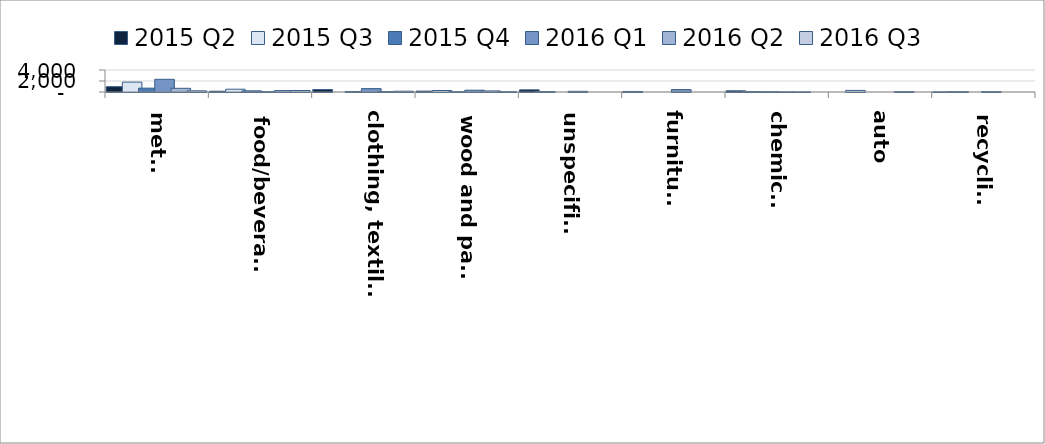
| Category | 2015 Q2 | 2015 Q3 | 2015 Q4 | 2016 Q1 | 2016 Q2 | 2016 Q3 |
|---|---|---|---|---|---|---|
| metal | 966 | 1798 | 701 | 2308 | 673 | 213 |
| food/beverages | 143 | 506 | 210 | 60 | 251 | 274 |
| clothing, textile,
 leather | 444 | 0 | 96 | 614 | 76 | 140 |
| wood and paper | 161 | 271 | 49 | 324 | 195 | 51 |
| unspecified | 396 | 75 | 0 | 124 | 0 | 0 |
| furniture | 102 | 0 | 0 | 440 | 0 | 0 |
| chemical | 217 | 93 | 56 | 21 | 18 | 0 |
| auto | 0 | 292 | 0 | 0 | 67 | 0 |
| recycling | 19 | 65 | 0 | 64 | 0 | 0 |